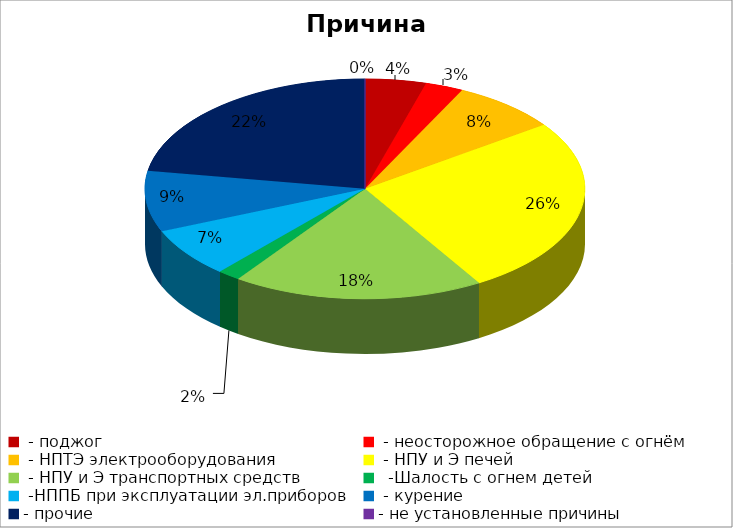
| Category | Причина пожара |
|---|---|
|  - поджог | 8 |
|  - неосторожное обращение с огнём | 5 |
|  - НПТЭ электрооборудования | 14 |
|  - НПУ и Э печей | 47 |
|  - НПУ и Э транспортных средств | 33 |
|   -Шалость с огнем детей | 3 |
|  -НППБ при эксплуатации эл.приборов | 13 |
|  - курение | 16 |
| - прочие | 40 |
| - не установленные причины | 0 |